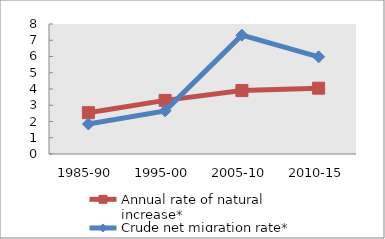
| Category | Annual rate of natural increase* | Crude net migration rate* |
|---|---|---|
| 1985-90 | 2.542 | 1.846 |
| 1995-00 | 3.3 | 2.656 |
| 2005-10 | 3.903 | 7.314 |
| 2010-15 | 4.05 | 5.979 |